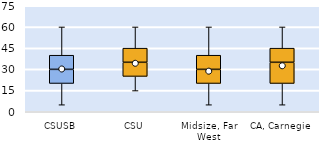
| Category | 25th | 50th | 75th |
|---|---|---|---|
| CSUSB | 20 | 10 | 10 |
| CSU | 25 | 10 | 10 |
| Midsize, Far West | 20 | 10 | 10 |
| CA, Carnegie | 20 | 15 | 10 |